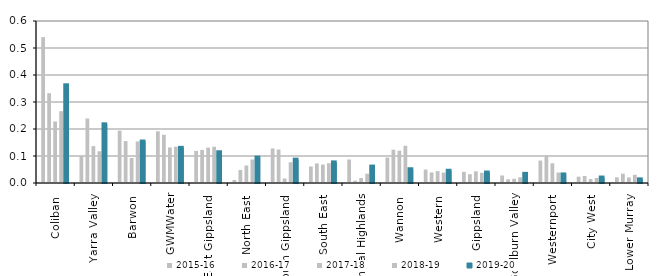
| Category | 2015-16 | 2016-17 | 2017-18 | 2018-19 | 2019-20 |
|---|---|---|---|---|---|
| Coliban  | 0.54 | 0.333 | 0.228 | 0.266 | 0.362 |
| Yarra Valley  | 0.1 | 0.239 | 0.137 | 0.118 | 0.217 |
| Barwon  | 0.194 | 0.155 | 0.093 | 0.154 | 0.154 |
| GWMWater | 0.192 | 0.179 | 0.132 | 0.134 | 0.13 |
| East Gippsland  | 0.119 | 0.122 | 0.131 | 0.134 | 0.114 |
| North East  | 0.011 | 0.048 | 0.065 | 0.087 | 0.094 |
| South Gippsland  | 0.128 | 0.124 | 0.017 | 0.077 | 0.086 |
| South East  | 0.061 | 0.072 | 0.068 | 0.073 | 0.076 |
| Central Highlands  | 0.087 | 0.008 | 0.018 | 0.034 | 0.061 |
| Wannon  | 0.094 | 0.123 | 0.12 | 0.138 | 0.051 |
| Western  | 0.05 | 0.039 | 0.044 | 0.039 | 0.045 |
| Gippsland  | 0.041 | 0.033 | 0.043 | 0.038 | 0.039 |
| Goulburn Valley  | 0.028 | 0.014 | 0.015 | 0.021 | 0.034 |
| Westernport  | 0.083 | 0.102 | 0.073 | 0.039 | 0.032 |
| City West  | 0.023 | 0.026 | 0.015 | 0.019 | 0.02 |
| Lower Murray  | 0.021 | 0.035 | 0.02 | 0.03 | 0.013 |